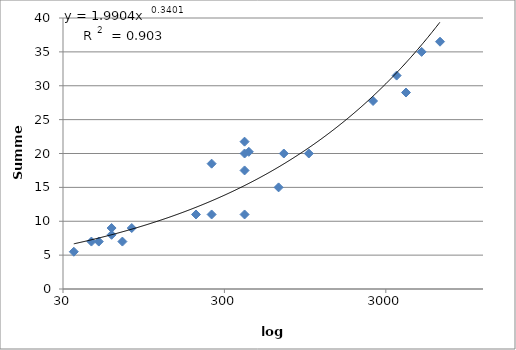
| Category | Series 0 |
|---|---|
| 35.0 | 5.5 |
| 45.0 | 7 |
| 50.0 | 7 |
| 60.0 | 8 |
| 60.0 | 9 |
| 70.0 | 7 |
| 80.0 | 9 |
| 200.0 | 11 |
| 250.0 | 11 |
| 250.0 | 18.5 |
| 400.0 | 11 |
| 400.0 | 20 |
| 400.0 | 21.75 |
| 400.0 | 17.5 |
| 425.0 | 20.25 |
| 650.0 | 15 |
| 700.0 | 20 |
| 1000.0 | 20 |
| 2500.0 | 27.75 |
| 3500.0 | 31.5 |
| 4000.0 | 29 |
| 5000.0 | 35 |
| 6500.0 | 36.5 |